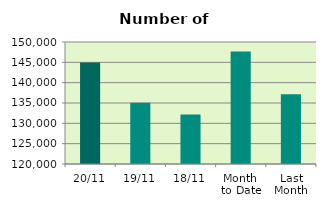
| Category | Series 0 |
|---|---|
| 20/11 | 144932 |
| 19/11 | 135086 |
| 18/11 | 132154 |
| Month 
to Date | 147638.143 |
| Last
Month | 137122.087 |